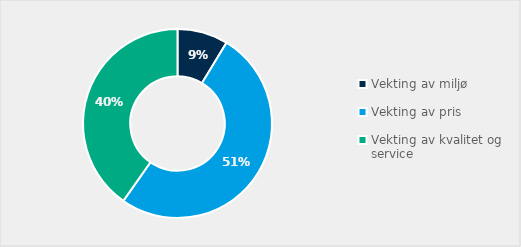
| Category | Series 0 |
|---|---|
| Vekting av miljø | 0.087 |
| Vekting av pris | 0.51 |
| Vekting av kvalitet og service | 0.403 |